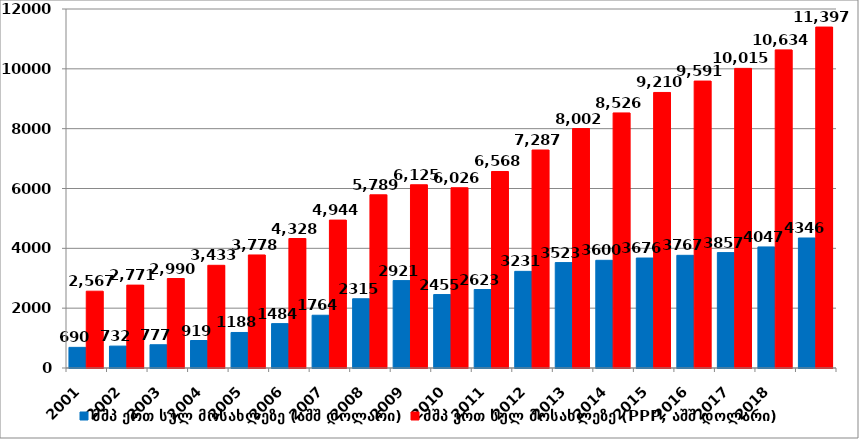
| Category | მშპ ერთ სულ მოსახლეზე (აშშ დოლარი) | მშპ ერთ სულ მოსახლეზე (PPP, აშშ დოლარი) |
|---|---|---|
| 2001.0 | 689.722 | 2567.096 |
| 2002.0 | 731.82 | 2770.522 |
| 2003.0 | 777.264 | 2990.347 |
| 2004.0 | 918.993 | 3432.625 |
| 2005.0 | 1187.597 | 3778.259 |
| 2006.0 | 1483.508 | 4328.042 |
| 2007.0 | 1763.507 | 4944.11 |
| 2008.0 | 2314.588 | 5788.621 |
| 2009.0 | 2921.097 | 6124.74 |
| 2010.0 | 2455.205 | 6025.587 |
| 2011.0 | 2622.964 | 6568.292 |
| 2012.0 | 3230.675 | 7286.867 |
| 2013.0 | 3523.4 | 8002.44 |
| 2014.0 | 3599.597 | 8525.998 |
| 2015.0 | 3676.169 | 9210.155 |
| 2016.0 | 3766.629 | 9590.963 |
| 2017.0 | 3857.25 | 10014.955 |
| 2018.0 | 4046.814 | 10633.649 |